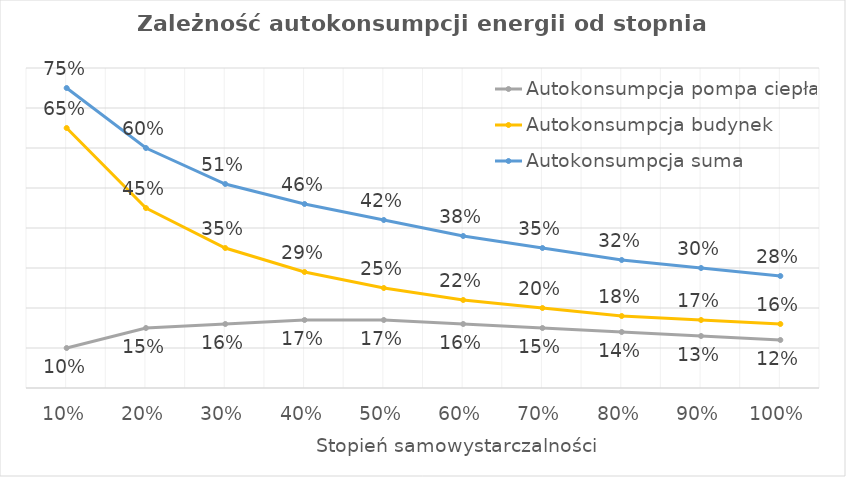
| Category | Autokonsumpcja pompa ciepła | Autokonsumpcja budynek | Autokonsumpcja suma |
|---|---|---|---|
| 0.1 | 0.1 | 0.65 | 0.75 |
| 0.2 | 0.15 | 0.45 | 0.6 |
| 0.3 | 0.16 | 0.35 | 0.51 |
| 0.4 | 0.17 | 0.29 | 0.46 |
| 0.5 | 0.17 | 0.25 | 0.42 |
| 0.6 | 0.16 | 0.22 | 0.38 |
| 0.7 | 0.15 | 0.2 | 0.35 |
| 0.8 | 0.14 | 0.18 | 0.32 |
| 0.9 | 0.13 | 0.17 | 0.3 |
| 1.0 | 0.12 | 0.16 | 0.28 |